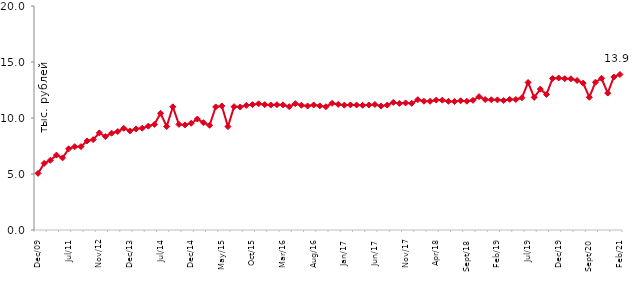
| Category | медианное значение среднедушевого располагаемого дохода, тыс. руб. |
|---|---|
| 2009-12-01 | 5.058 |
| 2010-04-01 | 5.949 |
| 2010-06-01 | 6.224 |
| 2010-09-01 | 6.686 |
| 2010-12-01 | 6.44 |
| 2011-07-01 | 7.25 |
| 2011-09-01 | 7.441 |
| 2011-12-01 | 7.446 |
| 2012-07-01 | 7.95 |
| 2012-09-01 | 8.071 |
| 2012-11-01 | 8.673 |
| 2012-12-01 | 8.345 |
| 2013-03-01 | 8.644 |
| 2013-06-01 | 8.789 |
| 2013-09-01 | 9.079 |
| 2013-12-01 | 8.849 |
| 2014-02-01 | 9.025 |
| 2014-04-01 | 9.087 |
| 2014-05-01 | 9.273 |
| 2014-06-01 | 9.432 |
| 2014-07-01 | 10.422 |
| 2014-08-01 | 9.241 |
| 2014-09-01 | 11 |
| 2014-10-01 | 9.426 |
| 2014-11-01 | 9.381 |
| 2014-12-01 | 9.532 |
| 2015-01-01 | 9.908 |
| 2015-02-01 | 9.585 |
| 2015-03-01 | 9.35 |
| 2015-04-01 | 10.991 |
| 2015-05-01 | 11.076 |
| 2015-06-01 | 9.237 |
| 2015-07-01 | 11.013 |
| 2015-08-01 | 10.981 |
| 2015-09-01 | 11.124 |
| 2015-10-01 | 11.195 |
| 2015-11-01 | 11.268 |
| 2015-12-01 | 11.194 |
| 2016-01-01 | 11.158 |
| 2016-02-01 | 11.188 |
| 2016-03-01 | 11.174 |
| 2016-04-01 | 11.01 |
| 2016-05-01 | 11.278 |
| 2016-06-01 | 11.142 |
| 2016-07-01 | 11.072 |
| 2016-08-01 | 11.165 |
| 2016-09-01 | 11.082 |
| 2016-10-01 | 11.008 |
| 2016-11-01 | 11.313 |
| 2016-12-01 | 11.216 |
| 2017-01-01 | 11.146 |
| 2017-02-01 | 11.17 |
| 2017-03-01 | 11.162 |
| 2017-04-01 | 11.133 |
| 2017-05-01 | 11.163 |
| 2017-06-01 | 11.207 |
| 2017-07-01 | 11.066 |
| 2017-08-01 | 11.153 |
| 2017-09-01 | 11.395 |
| 2017-10-01 | 11.301 |
| 2017-11-01 | 11.342 |
| 2017-12-01 | 11.31 |
| 2018-01-01 | 11.637 |
| 2018-02-01 | 11.497 |
| 2018-03-01 | 11.49 |
| 2018-04-01 | 11.601 |
| 2018-05-01 | 11.592 |
| 2018-06-01 | 11.491 |
| 2018-07-01 | 11.471 |
| 2018-08-01 | 11.541 |
| 2018-09-01 | 11.497 |
| 2018-10-01 | 11.578 |
| 2018-11-01 | 11.906 |
| 2018-12-01 | 11.648 |
| 2019-01-01 | 11.629 |
| 2019-02-01 | 11.617 |
| 2019-03-01 | 11.566 |
| 2019-04-01 | 11.659 |
| 2019-05-01 | 11.653 |
| 2019-06-01 | 11.805 |
| 2019-07-01 | 13.174 |
| 2019-08-01 | 11.844 |
| 2019-09-01 | 12.577 |
| 2019-10-01 | 12.107 |
| 2019-11-01 | 13.523 |
| 2019-12-01 | 13.573 |
| 2020-01-01 | 13.516 |
| 2020-02-01 | 13.502 |
| 2020-03-01 | 13.349 |
| 2020-08-01 | 13.113 |
| 2020-09-01 | 11.853 |
| 2020-10-01 | 13.196 |
| 2020-11-01 | 13.544 |
| 2020-12-01 | 12.222 |
| 2021-01-01 | 13.659 |
| 2021-02-01 | 13.881 |